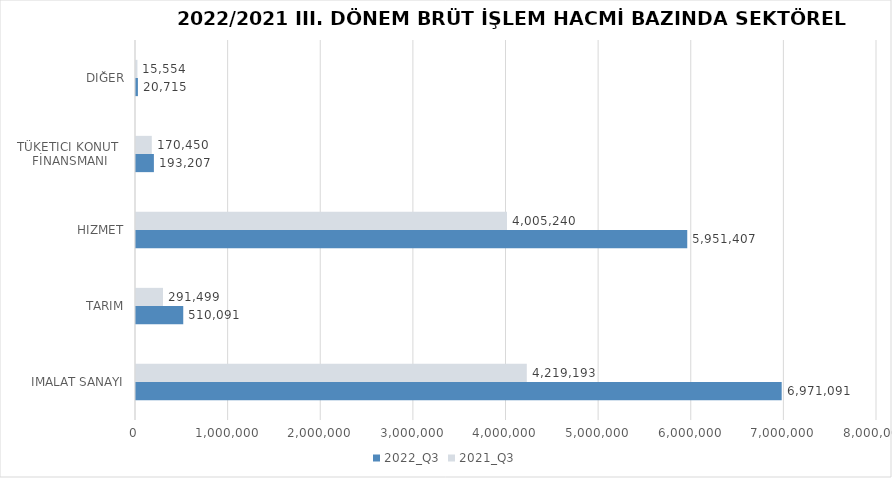
| Category | 2022_Q3 | 2021_Q3 |
|---|---|---|
| İMALAT SANAYİ | 6971090.586 | 4219193.223 |
| TARIM | 510090.841 | 291499.276 |
| HİZMET | 5951407.105 | 4005239.943 |
| TÜKETİCİ KONUT 
FİNANSMANI | 193207 | 170450 |
| DİĞER | 20715 | 15554 |